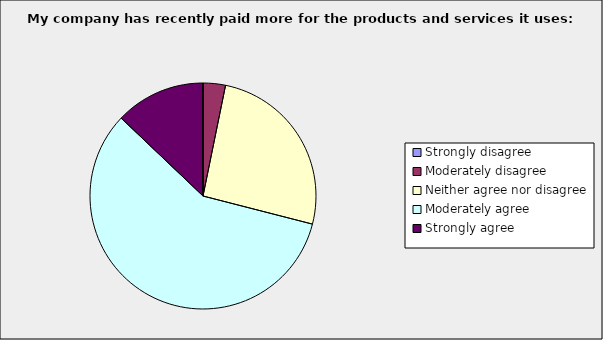
| Category | Series 0 |
|---|---|
| Strongly disagree | 0 |
| Moderately disagree | 0.032 |
| Neither agree nor disagree | 0.258 |
| Moderately agree | 0.581 |
| Strongly agree | 0.129 |